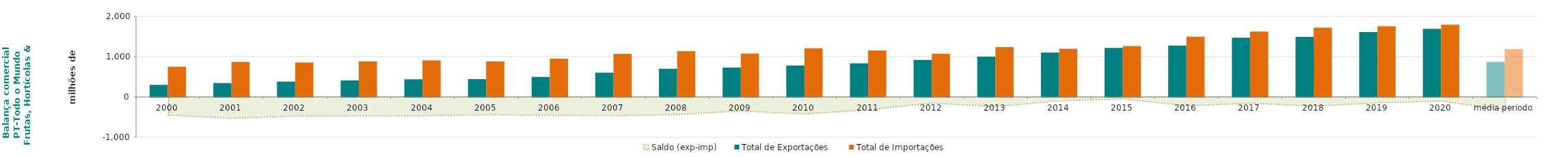
| Category | Total de Exportações  | Total de Importações  |
|---|---|---|
| 2000 | 298.97 | 751.669 |
| 2001 | 344.273 | 870.081 |
| 2002 | 380.48 | 856.16 |
| 2003 | 410.523 | 880.226 |
| 2004 | 437.374 | 906.434 |
| 2005 | 440.977 | 882.633 |
| 2006 | 496.484 | 950.801 |
| 2007 | 601.746 | 1066.43 |
| 2008 | 699.012 | 1136.896 |
| 2009 | 729.671 | 1077.488 |
| 2010 | 780.307 | 1206.18 |
| 2011 | 836.622 | 1152.087 |
| 2012 | 920.934 | 1073.394 |
| 2013 | 999.936 | 1238.777 |
| 2014 | 1101.402 | 1196.038 |
| 2015 | 1213.991 | 1263.516 |
| 2016 | 1273.454 | 1496.085 |
| 2017 | 1469.71 | 1621.929 |
| 2018 | 1492.933 | 1721.854 |
| 2019 | 1612.206 | 1755.978 |
| 2020 | 1688.877 | 1793.434 |
| média período | 868.09 | 1185.623 |